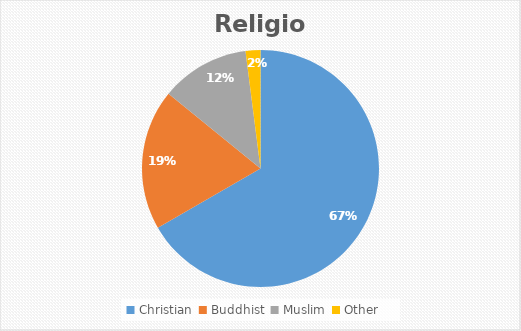
| Category | Series 0 |
|---|---|
| Christian  | 0.667 |
| Buddhist  | 0.192 |
| Muslim  | 0.121 |
| Other  | 0.02 |